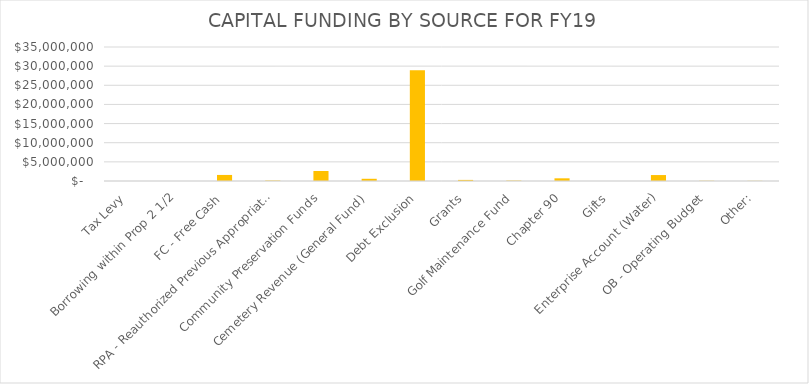
| Category | Series 3 |
|---|---|
| Tax Levy | 0 |
| Borrowing within Prop 2 1/2 | 0 |
| FC - Free Cash | 1581000 |
| RPA - Reauthorized Previous Appropriation  | 125000 |
| Community Preservation Funds | 2606368 |
| Cemetery Revenue (General Fund) | 577950 |
| Debt Exclusion | 28930000 |
| Grants | 285000 |
| Golf Maintenance Fund | 109000 |
| Chapter 90 | 700000 |
| Gifts | 0 |
| Enterprise Account (Water) | 1553700 |
| OB - Operating Budget | 60600 |
| Other: | 40000 |